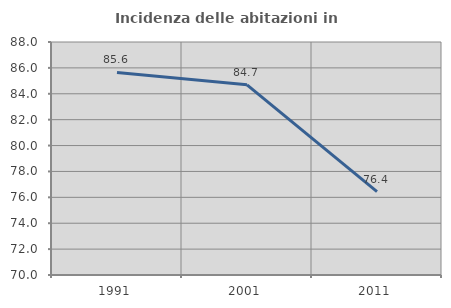
| Category | Incidenza delle abitazioni in proprietà  |
|---|---|
| 1991.0 | 85.649 |
| 2001.0 | 84.689 |
| 2011.0 | 76.447 |